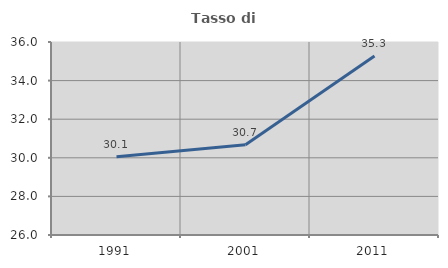
| Category | Tasso di occupazione   |
|---|---|
| 1991.0 | 30.059 |
| 2001.0 | 30.68 |
| 2011.0 | 35.275 |